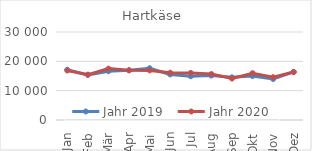
| Category | Jahr 2019 | Jahr 2020 |
|---|---|---|
| Jan | 17140.206 | 16878.869 |
| Feb | 15387.932 | 15455.184 |
| Mär | 16650.01 | 17521.93 |
| Apr | 16989.036 | 16929.27 |
| Mai | 17660.796 | 16903.71 |
| Jun | 15524.341 | 16127.797 |
| Jul | 14914.028 | 16048.253 |
| Aug | 15165.879 | 15662.285 |
| Sep | 14545.994 | 14132.734 |
| Okt | 14972.519 | 15955.354 |
| Nov | 13977.236 | 14574.081 |
| Dez | 16382.455 | 16356.42 |